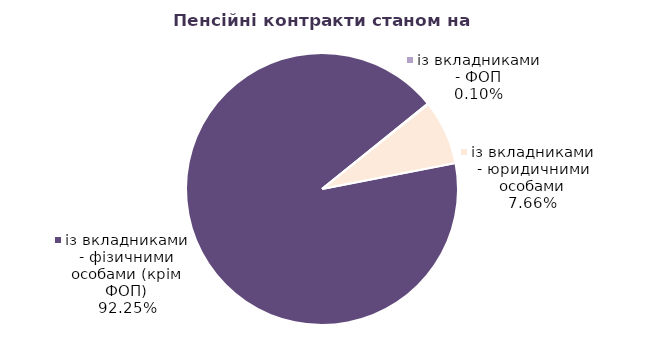
| Category | Series 0 |
|---|---|
| із вкладниками - фізичними особами (крім ФОП) | 80550 |
| із вкладниками - ФОП | 84 |
| із вкладниками - юридичними особами | 6687 |